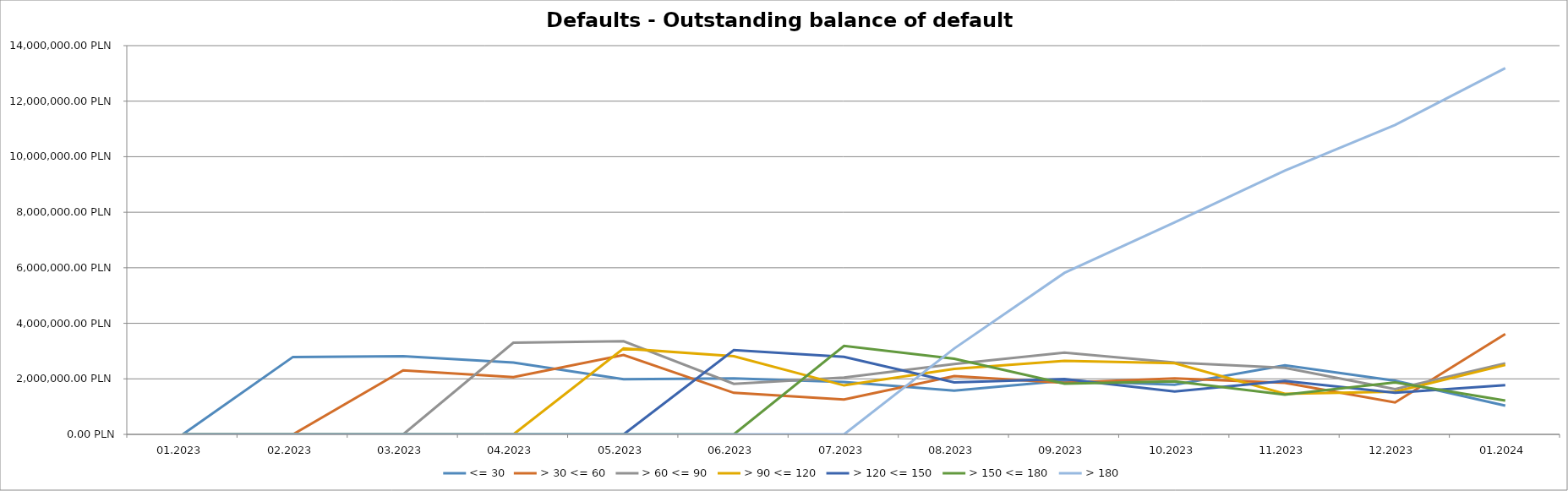
| Category | <= 30 | > 30 <= 60 | > 60 <= 90 | > 90 <= 120 | > 120 <= 150 | > 150 <= 180 | > 180 |
|---|---|---|---|---|---|---|---|
| 01.2023 | 0 | 0 | 0 | 0 | 0 | 0 | 0 |
| 02.2023 | 2788519.82 | 0 | 0 | 0 | 0 | 0 | 0 |
| 03.2023 | 2811517.14 | 2305154.07 | 0 | 0 | 0 | 0 | 0 |
| 04.2023 | 2584791.3 | 2064675.87 | 3301101.31 | 0 | 0 | 0 | 0 |
| 05.2023 | 1985441.56 | 2858398.5 | 3353485.78 | 3091988.77 | 0 | 0 | 0 |
| 06.2023 | 2016845.02 | 1496657.8 | 1822162.63 | 2812422.86 | 3037767.68 | 0 | 0 |
| 07.2023 | 1886118.05 | 1257979.4 | 2047168.21 | 1762916.26 | 2793763.11 | 3184053.47 | 0 |
| 08.2023 | 1572650.17 | 2099798.77 | 2534461.69 | 2357426.74 | 1871124.51 | 2723545.23 | 3093972.9 |
| 09.2023 | 1936023.84 | 1858916.55 | 2940706.37 | 2644290.89 | 1991761.95 | 1826544.8 | 5816448.05 |
| 10.2023 | 1787856.09 | 2019010.42 | 2585069.36 | 2560620.78 | 1548143.78 | 1909160.81 | 7632122.35 |
| 11.2023 | 2487439.47 | 1854213.59 | 2398255.83 | 1460739.8 | 1923073.63 | 1431220.99 | 9496137.88 |
| 12.2023 | 1933713.74 | 1149222.92 | 1628673.09 | 1540023.57 | 1499486.96 | 1871239.58 | 11143858.33 |
| 01.2024 | 1036575.14 | 3616872.94 | 2560909.55 | 2500120.14 | 1769512.28 | 1214846.09 | 13190834.36 |